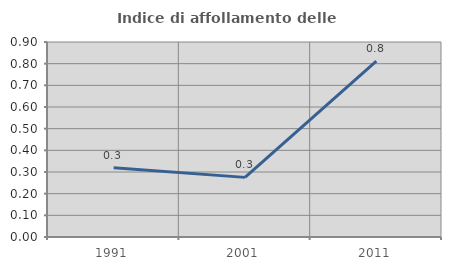
| Category | Indice di affollamento delle abitazioni  |
|---|---|
| 1991.0 | 0.32 |
| 2001.0 | 0.275 |
| 2011.0 | 0.811 |